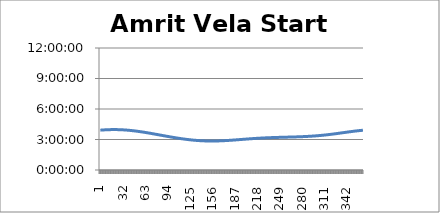
| Category | Amrit Vela Start Time |
|---|---|
| 0 | 0.163 |
| 1 | 0.163 |
| 2 | 0.164 |
| 3 | 0.164 |
| 4 | 0.164 |
| 5 | 0.164 |
| 6 | 0.164 |
| 7 | 0.165 |
| 8 | 0.165 |
| 9 | 0.165 |
| 10 | 0.165 |
| 11 | 0.165 |
| 12 | 0.165 |
| 13 | 0.165 |
| 14 | 0.165 |
| 15 | 0.166 |
| 16 | 0.166 |
| 17 | 0.166 |
| 18 | 0.166 |
| 19 | 0.166 |
| 20 | 0.166 |
| 21 | 0.166 |
| 22 | 0.166 |
| 23 | 0.166 |
| 24 | 0.165 |
| 25 | 0.165 |
| 26 | 0.165 |
| 27 | 0.165 |
| 28 | 0.165 |
| 29 | 0.165 |
| 30 | 0.165 |
| 31 | 0.165 |
| 32 | 0.164 |
| 33 | 0.164 |
| 34 | 0.164 |
| 35 | 0.164 |
| 36 | 0.164 |
| 37 | 0.163 |
| 38 | 0.163 |
| 39 | 0.163 |
| 40 | 0.163 |
| 41 | 0.162 |
| 42 | 0.162 |
| 43 | 0.162 |
| 44 | 0.161 |
| 45 | 0.161 |
| 46 | 0.161 |
| 47 | 0.16 |
| 48 | 0.16 |
| 49 | 0.16 |
| 50 | 0.159 |
| 51 | 0.159 |
| 52 | 0.158 |
| 53 | 0.158 |
| 54 | 0.158 |
| 55 | 0.157 |
| 56 | 0.157 |
| 57 | 0.156 |
| 58 | 0.156 |
| 59 | 0.155 |
| 60 | 0.155 |
| 61 | 0.155 |
| 62 | 0.154 |
| 63 | 0.154 |
| 64 | 0.153 |
| 65 | 0.153 |
| 66 | 0.152 |
| 67 | 0.152 |
| 68 | 0.151 |
| 69 | 0.151 |
| 70 | 0.15 |
| 71 | 0.15 |
| 72 | 0.149 |
| 73 | 0.148 |
| 74 | 0.148 |
| 75 | 0.147 |
| 76 | 0.147 |
| 77 | 0.146 |
| 78 | 0.146 |
| 79 | 0.145 |
| 80 | 0.145 |
| 81 | 0.144 |
| 82 | 0.144 |
| 83 | 0.143 |
| 84 | 0.143 |
| 85 | 0.142 |
| 86 | 0.141 |
| 87 | 0.141 |
| 88 | 0.14 |
| 89 | 0.14 |
| 90 | 0.139 |
| 91 | 0.139 |
| 92 | 0.138 |
| 93 | 0.138 |
| 94 | 0.137 |
| 95 | 0.137 |
| 96 | 0.136 |
| 97 | 0.136 |
| 98 | 0.135 |
| 99 | 0.135 |
| 100 | 0.134 |
| 101 | 0.134 |
| 102 | 0.133 |
| 103 | 0.133 |
| 104 | 0.132 |
| 105 | 0.132 |
| 106 | 0.131 |
| 107 | 0.131 |
| 108 | 0.13 |
| 109 | 0.13 |
| 110 | 0.129 |
| 111 | 0.129 |
| 112 | 0.128 |
| 113 | 0.128 |
| 114 | 0.128 |
| 115 | 0.127 |
| 116 | 0.127 |
| 117 | 0.126 |
| 118 | 0.126 |
| 119 | 0.126 |
| 120 | 0.125 |
| 121 | 0.125 |
| 122 | 0.125 |
| 123 | 0.124 |
| 124 | 0.124 |
| 125 | 0.124 |
| 126 | 0.123 |
| 127 | 0.123 |
| 128 | 0.123 |
| 129 | 0.122 |
| 130 | 0.122 |
| 131 | 0.122 |
| 132 | 0.122 |
| 133 | 0.121 |
| 134 | 0.121 |
| 135 | 0.121 |
| 136 | 0.121 |
| 137 | 0.12 |
| 138 | 0.12 |
| 139 | 0.12 |
| 140 | 0.12 |
| 141 | 0.12 |
| 142 | 0.12 |
| 143 | 0.12 |
| 144 | 0.119 |
| 145 | 0.119 |
| 146 | 0.119 |
| 147 | 0.119 |
| 148 | 0.119 |
| 149 | 0.119 |
| 150 | 0.119 |
| 151 | 0.119 |
| 152 | 0.119 |
| 153 | 0.119 |
| 154 | 0.119 |
| 155 | 0.119 |
| 156 | 0.119 |
| 157 | 0.119 |
| 158 | 0.119 |
| 159 | 0.119 |
| 160 | 0.119 |
| 161 | 0.119 |
| 162 | 0.119 |
| 163 | 0.119 |
| 164 | 0.119 |
| 165 | 0.119 |
| 166 | 0.119 |
| 167 | 0.12 |
| 168 | 0.12 |
| 169 | 0.12 |
| 170 | 0.12 |
| 171 | 0.12 |
| 172 | 0.12 |
| 173 | 0.12 |
| 174 | 0.121 |
| 175 | 0.121 |
| 176 | 0.121 |
| 177 | 0.121 |
| 178 | 0.121 |
| 179 | 0.122 |
| 180 | 0.122 |
| 181 | 0.122 |
| 182 | 0.122 |
| 183 | 0.122 |
| 184 | 0.123 |
| 185 | 0.123 |
| 186 | 0.123 |
| 187 | 0.123 |
| 188 | 0.123 |
| 189 | 0.124 |
| 190 | 0.124 |
| 191 | 0.124 |
| 192 | 0.124 |
| 193 | 0.125 |
| 194 | 0.125 |
| 195 | 0.125 |
| 196 | 0.125 |
| 197 | 0.126 |
| 198 | 0.126 |
| 199 | 0.126 |
| 200 | 0.126 |
| 201 | 0.126 |
| 202 | 0.127 |
| 203 | 0.127 |
| 204 | 0.127 |
| 205 | 0.127 |
| 206 | 0.128 |
| 207 | 0.128 |
| 208 | 0.128 |
| 209 | 0.128 |
| 210 | 0.128 |
| 211 | 0.129 |
| 212 | 0.129 |
| 213 | 0.129 |
| 214 | 0.129 |
| 215 | 0.129 |
| 216 | 0.13 |
| 217 | 0.13 |
| 218 | 0.13 |
| 219 | 0.13 |
| 220 | 0.13 |
| 221 | 0.13 |
| 222 | 0.131 |
| 223 | 0.131 |
| 224 | 0.131 |
| 225 | 0.131 |
| 226 | 0.131 |
| 227 | 0.131 |
| 228 | 0.132 |
| 229 | 0.132 |
| 230 | 0.132 |
| 231 | 0.132 |
| 232 | 0.132 |
| 233 | 0.132 |
| 234 | 0.132 |
| 235 | 0.132 |
| 236 | 0.133 |
| 237 | 0.133 |
| 238 | 0.133 |
| 239 | 0.133 |
| 240 | 0.133 |
| 241 | 0.133 |
| 242 | 0.133 |
| 243 | 0.133 |
| 244 | 0.133 |
| 245 | 0.134 |
| 246 | 0.134 |
| 247 | 0.134 |
| 248 | 0.134 |
| 249 | 0.134 |
| 250 | 0.134 |
| 251 | 0.134 |
| 252 | 0.134 |
| 253 | 0.134 |
| 254 | 0.134 |
| 255 | 0.134 |
| 256 | 0.134 |
| 257 | 0.135 |
| 258 | 0.135 |
| 259 | 0.135 |
| 260 | 0.135 |
| 261 | 0.135 |
| 262 | 0.135 |
| 263 | 0.135 |
| 264 | 0.135 |
| 265 | 0.135 |
| 266 | 0.135 |
| 267 | 0.135 |
| 268 | 0.135 |
| 269 | 0.135 |
| 270 | 0.136 |
| 271 | 0.136 |
| 272 | 0.136 |
| 273 | 0.136 |
| 274 | 0.136 |
| 275 | 0.136 |
| 276 | 0.136 |
| 277 | 0.136 |
| 278 | 0.136 |
| 279 | 0.137 |
| 280 | 0.137 |
| 281 | 0.137 |
| 282 | 0.137 |
| 283 | 0.137 |
| 284 | 0.137 |
| 285 | 0.137 |
| 286 | 0.137 |
| 287 | 0.138 |
| 288 | 0.138 |
| 289 | 0.138 |
| 290 | 0.138 |
| 291 | 0.138 |
| 292 | 0.139 |
| 293 | 0.139 |
| 294 | 0.139 |
| 295 | 0.139 |
| 296 | 0.139 |
| 297 | 0.14 |
| 298 | 0.14 |
| 299 | 0.14 |
| 300 | 0.14 |
| 301 | 0.14 |
| 302 | 0.141 |
| 303 | 0.141 |
| 304 | 0.141 |
| 305 | 0.142 |
| 306 | 0.142 |
| 307 | 0.142 |
| 308 | 0.142 |
| 309 | 0.143 |
| 310 | 0.143 |
| 311 | 0.143 |
| 312 | 0.144 |
| 313 | 0.144 |
| 314 | 0.144 |
| 315 | 0.145 |
| 316 | 0.145 |
| 317 | 0.145 |
| 318 | 0.146 |
| 319 | 0.146 |
| 320 | 0.146 |
| 321 | 0.147 |
| 322 | 0.147 |
| 323 | 0.147 |
| 324 | 0.148 |
| 325 | 0.148 |
| 326 | 0.149 |
| 327 | 0.149 |
| 328 | 0.149 |
| 329 | 0.15 |
| 330 | 0.15 |
| 331 | 0.151 |
| 332 | 0.151 |
| 333 | 0.151 |
| 334 | 0.152 |
| 335 | 0.152 |
| 336 | 0.153 |
| 337 | 0.153 |
| 338 | 0.154 |
| 339 | 0.154 |
| 340 | 0.154 |
| 341 | 0.155 |
| 342 | 0.155 |
| 343 | 0.156 |
| 344 | 0.156 |
| 345 | 0.156 |
| 346 | 0.157 |
| 347 | 0.157 |
| 348 | 0.158 |
| 349 | 0.158 |
| 350 | 0.158 |
| 351 | 0.159 |
| 352 | 0.159 |
| 353 | 0.159 |
| 354 | 0.16 |
| 355 | 0.16 |
| 356 | 0.16 |
| 357 | 0.161 |
| 358 | 0.161 |
| 359 | 0.161 |
| 360 | 0.162 |
| 361 | 0.162 |
| 362 | 0.162 |
| 363 | 0.163 |
| 364 | 0.163 |
| 365 | 0.163 |